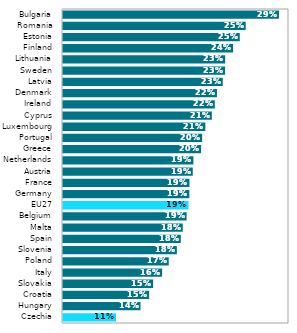
| Category | Series 0 |
|---|---|
| Czechia | 0.109 |
| Hungary | 0.136 |
| Croatia | 0.145 |
| Slovakia | 0.15 |
| Italy | 0.16 |
| Poland | 0.167 |
| Slovenia | 0.176 |
| Spain | 0.18 |
| Malta | 0.182 |
| Belgium | 0.187 |
| EU27 | 0.189 |
| Germany | 0.19 |
| France | 0.19 |
| Austria | 0.194 |
| Netherlands | 0.194 |
| Greece | 0.203 |
| Portugal | 0.204 |
| Luxembourg | 0.207 |
| Cyprus | 0.215 |
| Ireland | 0.218 |
| Denmark | 0.22 |
| Latvia | 0.227 |
| Sweden | 0.229 |
| Lithuania | 0.229 |
| Finland | 0.238 |
| Estonia | 0.246 |
| Romania | 0.252 |
| Bulgaria | 0.289 |